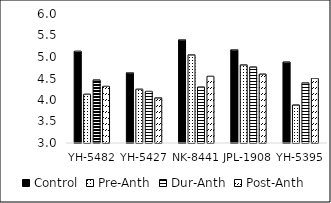
| Category | Control | Pre-Anth | Dur-Anth | Post-Anth |
|---|---|---|---|---|
| YH-5482 | 5.133 | 4.133 | 4.467 | 4.317 |
| YH-5427 | 4.633 | 4.25 | 4.2 | 4.05 |
| NK-8441 | 5.4 | 5.05 | 4.3 | 4.55 |
| JPL-1908 | 5.167 | 4.817 | 4.767 | 4.6 |
| YH-5395 | 4.883 | 3.883 | 4.4 | 4.5 |